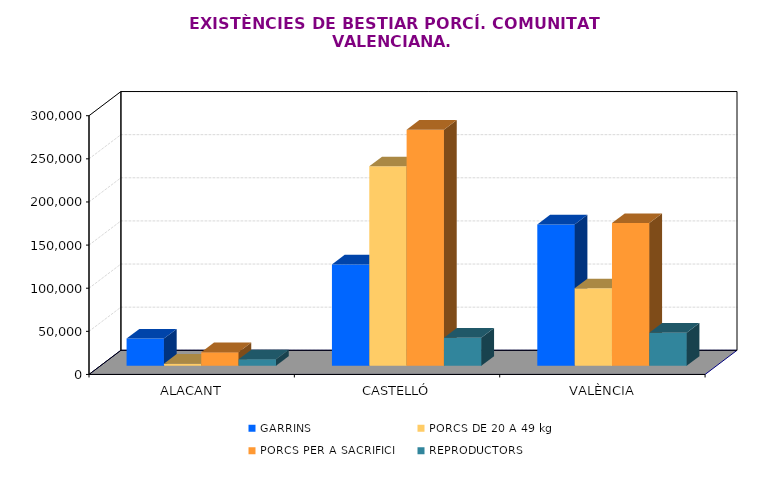
| Category | GARRINS | PORCS DE 20 A 49 kg | PORCS PER A SACRIFICI | REPRODUCTORS |
|---|---|---|---|---|
| ALACANT | 31582 | 2408 | 15866 | 7529 |
| CASTELLÓ | 117594 | 231298 | 273746 | 32684 |
| VALÈNCIA | 163846 | 89874 | 165468 | 38428 |